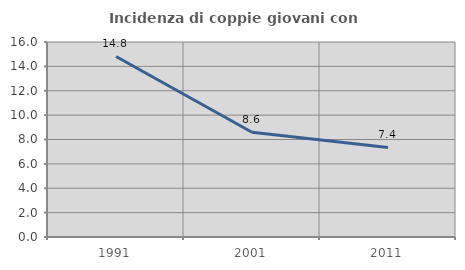
| Category | Incidenza di coppie giovani con figli |
|---|---|
| 1991.0 | 14.813 |
| 2001.0 | 8.6 |
| 2011.0 | 7.351 |